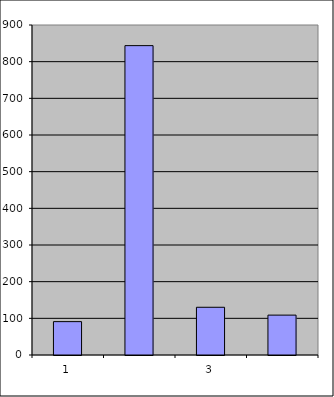
| Category | Series 0 |
|---|---|
| 0 | 91 |
| 1 | 843.727 |
| 2 | 130.152 |
| 3 | 108.78 |